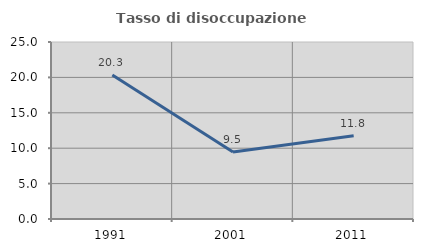
| Category | Tasso di disoccupazione giovanile  |
|---|---|
| 1991.0 | 20.339 |
| 2001.0 | 9.459 |
| 2011.0 | 11.765 |